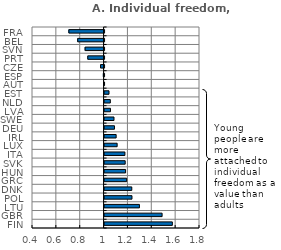
| Category | 2018 |
|---|---|
| FIN | 1.568 |
| GBR | 1.482 |
| LTU | 1.292 |
| POL | 1.23 |
| DNK | 1.228 |
| GRC | 1.185 |
| HUN | 1.176 |
| SVK | 1.173 |
| ITA | 1.17 |
| LUX | 1.105 |
| IRL | 1.097 |
| DEU | 1.083 |
| SWE | 1.079 |
| LVA | 1.049 |
| NLD | 1.048 |
| EST | 1.037 |
| AUT | 0.998 |
| ESP | 0.994 |
| CZE | 0.971 |
| PRT | 0.863 |
| SVN | 0.841 |
| BEL | 0.779 |
| FRA | 0.705 |